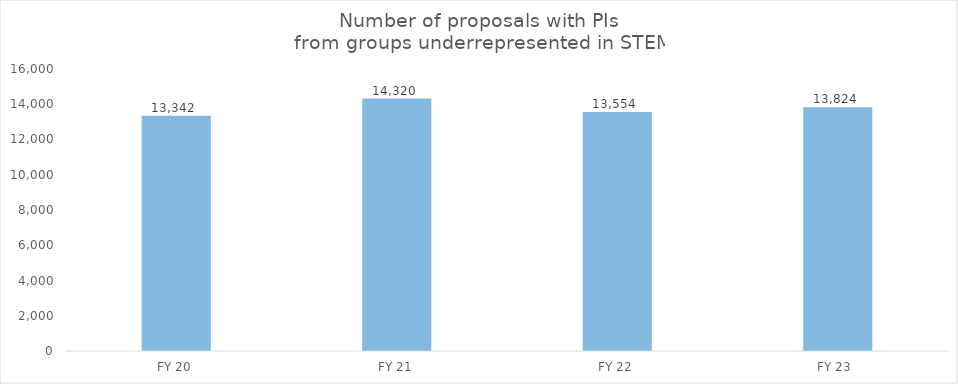
| Category | Series 1 |
|---|---|
| FY 20 | 13342 |
| FY 21 | 14320 |
| FY 22 | 13554 |
| FY 23  | 13824 |